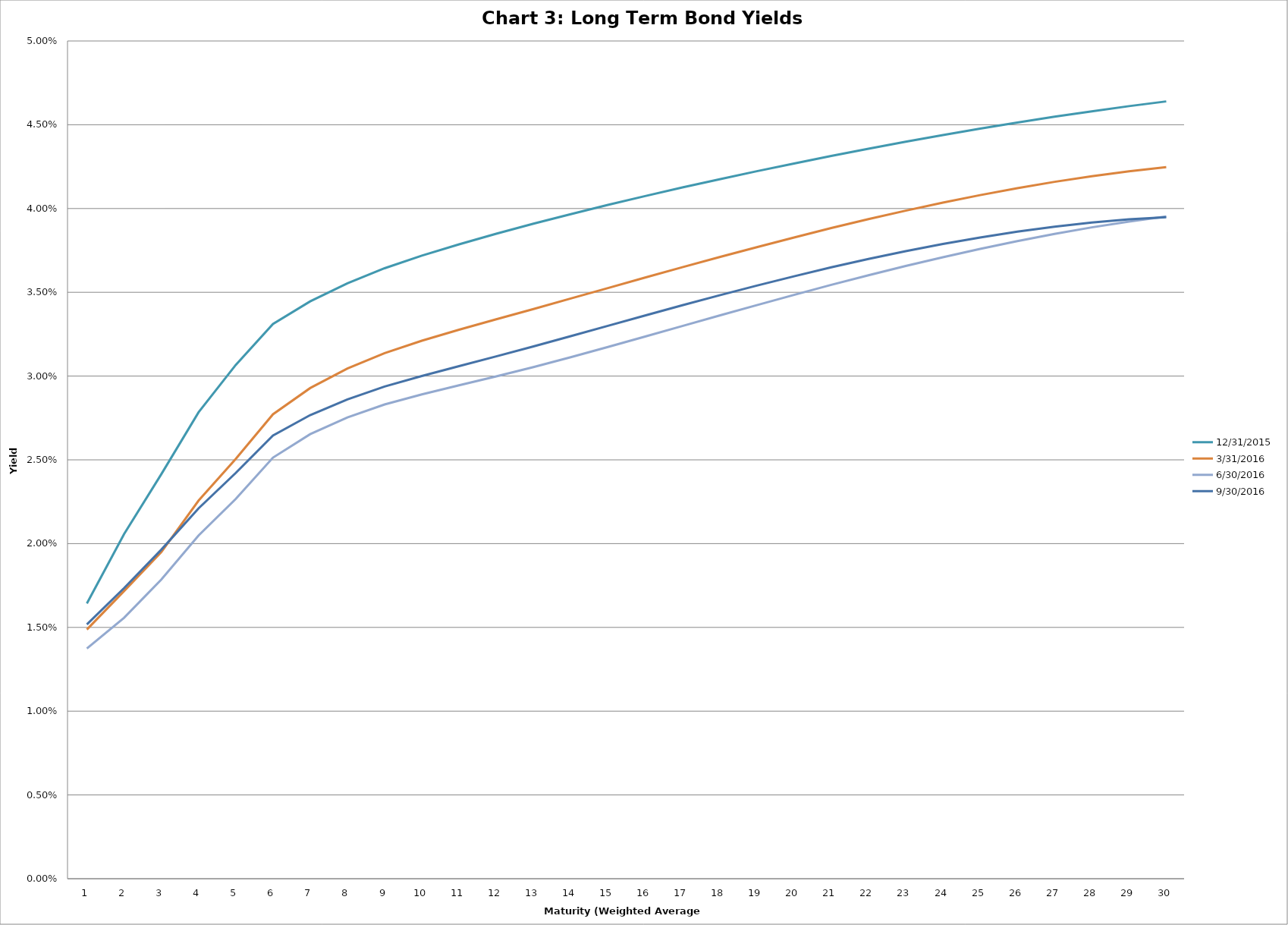
| Category | 12/31/2015 | 3/31/2016 | 6/30/2016 | 9/30/2016 |
|---|---|---|---|---|
| 0 | 0.016 | 0.015 | 0.014 | 0.015 |
| 1 | 0.021 | 0.017 | 0.016 | 0.017 |
| 2 | 0.024 | 0.019 | 0.018 | 0.02 |
| 3 | 0.028 | 0.023 | 0.02 | 0.022 |
| 4 | 0.031 | 0.025 | 0.023 | 0.024 |
| 5 | 0.033 | 0.028 | 0.025 | 0.026 |
| 6 | 0.034 | 0.029 | 0.027 | 0.028 |
| 7 | 0.036 | 0.03 | 0.028 | 0.029 |
| 8 | 0.036 | 0.031 | 0.028 | 0.029 |
| 9 | 0.037 | 0.032 | 0.029 | 0.03 |
| 10 | 0.038 | 0.033 | 0.029 | 0.031 |
| 11 | 0.038 | 0.033 | 0.03 | 0.031 |
| 12 | 0.039 | 0.034 | 0.031 | 0.032 |
| 13 | 0.04 | 0.035 | 0.031 | 0.032 |
| 14 | 0.04 | 0.035 | 0.032 | 0.033 |
| 15 | 0.041 | 0.036 | 0.032 | 0.034 |
| 16 | 0.041 | 0.036 | 0.033 | 0.034 |
| 17 | 0.042 | 0.037 | 0.034 | 0.035 |
| 18 | 0.042 | 0.038 | 0.034 | 0.035 |
| 19 | 0.043 | 0.038 | 0.035 | 0.036 |
| 20 | 0.043 | 0.039 | 0.035 | 0.036 |
| 21 | 0.044 | 0.039 | 0.036 | 0.037 |
| 22 | 0.044 | 0.04 | 0.037 | 0.037 |
| 23 | 0.044 | 0.04 | 0.037 | 0.038 |
| 24 | 0.045 | 0.041 | 0.038 | 0.038 |
| 25 | 0.045 | 0.041 | 0.038 | 0.039 |
| 26 | 0.045 | 0.042 | 0.038 | 0.039 |
| 27 | 0.046 | 0.042 | 0.039 | 0.039 |
| 28 | 0.046 | 0.042 | 0.039 | 0.039 |
| 29 | 0.046 | 0.042 | 0.04 | 0.039 |